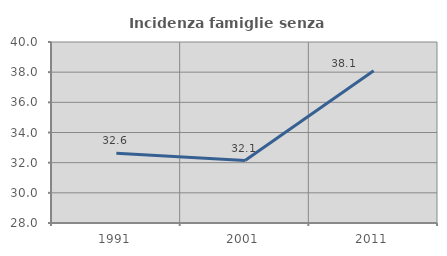
| Category | Incidenza famiglie senza nuclei |
|---|---|
| 1991.0 | 32.628 |
| 2001.0 | 32.143 |
| 2011.0 | 38.095 |